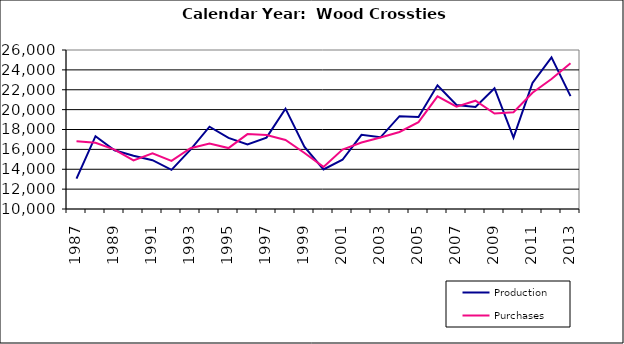
| Category | Production | Purchases |
|---|---|---|
| 1987.0 | 13059 | 16814 |
| 1988.0 | 17325 | 16665 |
| 1989.0 | 15906 | 15972 |
| 1990.0 | 15353 | 14898 |
| 1991.0 | 14910 | 15613 |
| 1992.0 | 13943 | 14841 |
| 1993.0 | 15980 | 16113 |
| 1994.0 | 18280 | 16600 |
| 1995.0 | 17157 | 16131 |
| 1996.0 | 16490 | 17539 |
| 1997.0 | 17188 | 17439 |
| 1998.0 | 20099 | 16950 |
| 1999.0 | 16256 | 15640 |
| 2000.0 | 13983.1 | 14235.1 |
| 2001.0 | 14957 | 15981 |
| 2002.0 | 17467.591 | 16685.945 |
| 2003.0 | 17213.928 | 17193.927 |
| 2004.0 | 19338.37 | 17749.231 |
| 2005.0 | 19260.619 | 18744.891 |
| 2006.0 | 22448.548 | 21332.775 |
| 2007.0 | 20471.092 | 20301.696 |
| 2008.0 | 20258.46 | 20896.232 |
| 2009.0 | 22156.289 | 19604.055 |
| 2010.0 | 17190.1 | 19735.982 |
| 2011.0 | 22689.418 | 21699.581 |
| 2012.0 | 25264.451 | 23081.551 |
| 2013.0 | 21359.765 | 24664.451 |